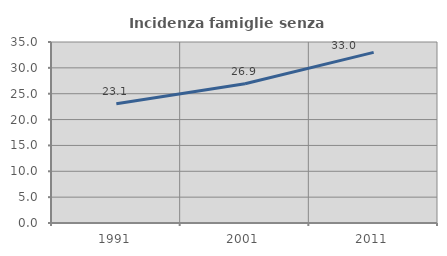
| Category | Incidenza famiglie senza nuclei |
|---|---|
| 1991.0 | 23.054 |
| 2001.0 | 26.931 |
| 2011.0 | 32.996 |